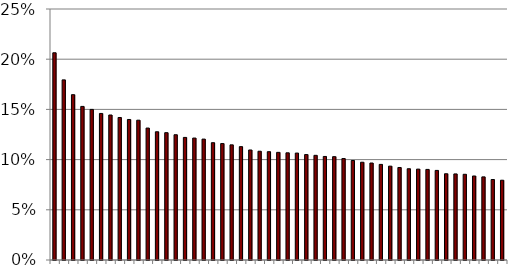
| Category | Series 0 |
|---|---|
| NM | 0.206 |
| CA | 0.179 |
| NV | 0.165 |
| LA | 0.153 |
| OH | 0.15 |
| AK | 0.146 |
| CO | 0.144 |
| ID | 0.142 |
| IL | 0.14 |
| PA | 0.139 |
| ME | 0.131 |
| WI | 0.128 |
| UT | 0.127 |
| TX | 0.125 |
| MT | 0.122 |
| NC | 0.121 |
| AZ | 0.12 |
| MA | 0.117 |
| OK | 0.116 |
| SD | 0.115 |
| AR | 0.113 |
| WY | 0.11 |
| RI | 0.108 |
| FL | 0.108 |
| CT | 0.107 |
| MS | 0.107 |
| NH | 0.107 |
| NY | 0.105 |
| NJ | 0.104 |
| MD | 0.103 |
| SC | 0.103 |
| HI | 0.101 |
| AL | 0.099 |
| DE | 0.097 |
| WV | 0.097 |
| IA | 0.095 |
| TN | 0.093 |
| VA | 0.092 |
| GA | 0.091 |
| VT | 0.091 |
| ND | 0.09 |
| IN | 0.089 |
| KY | 0.086 |
| WA | 0.086 |
| MO | 0.085 |
| KS | 0.084 |
| MN | 0.083 |
| OR | 0.08 |
| MI | 0.079 |